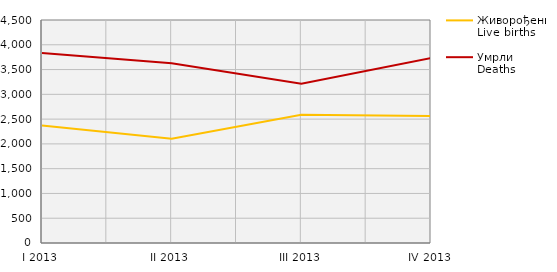
| Category | Живорођени
Live births | Умрли
Deaths |
|---|---|---|
| I 2013 | 2369 | 3833 |
| II 2013 | 2102 | 3626 |
| III 2013 | 2587 | 3214 |
| IV 2013 | 2561 | 3730 |